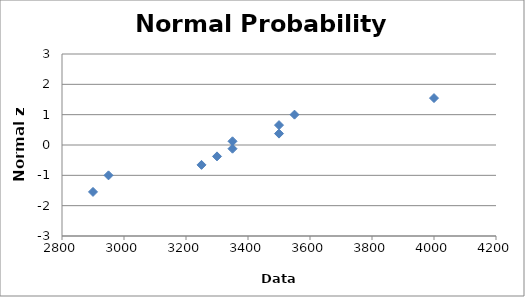
| Category | Series 0 |
|---|---|
| 2900.0 | -1.547 |
| 2950.0 | -1 |
| 3250.0 | -0.655 |
| 3300.0 | -0.375 |
| 3350.0 | -0.123 |
| 3350.0 | 0.123 |
| 3500.0 | 0.375 |
| 3500.0 | 0.655 |
| 3550.0 | 1 |
| 4000.0 | 1.547 |